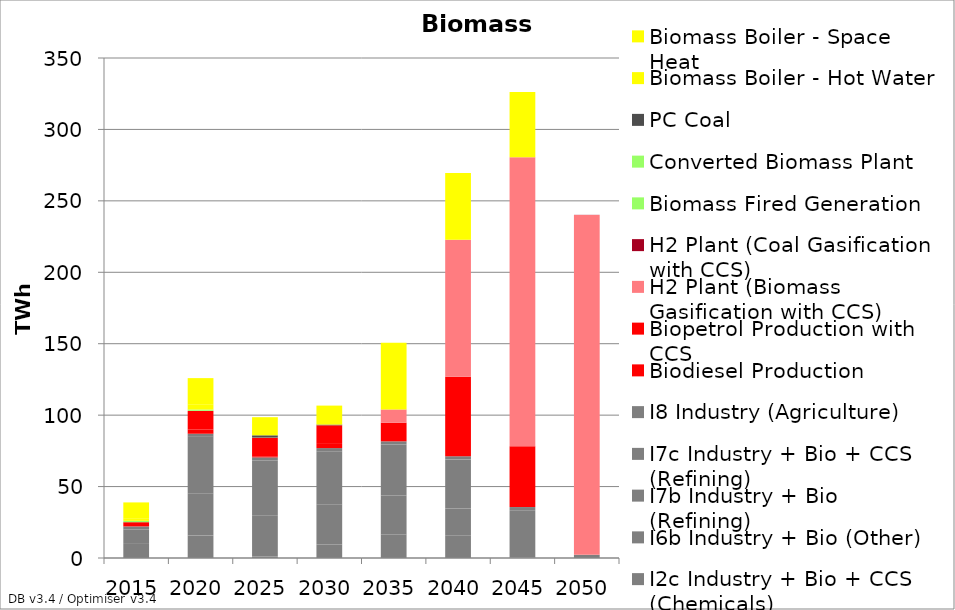
| Category | I2b Industry + Bio (Chemicals) | I2c Industry + Bio + CCS (Chemicals) | I6b Industry + Bio (Other) | I7b Industry + Bio (Refining) | I7c Industry + Bio + CCS (Refining) | I8 Industry (Agriculture) | Biodiesel Production | Biopetrol Production with CCS | H2 Plant (Biomass Gasification with CCS) | H2 Plant (Coal Gasification with CCS) | Biomass Fired Generation | Converted Biomass Plant | PC Coal | Biomass Boiler - Hot Water | Biomass Boiler - Space Heat |
|---|---|---|---|---|---|---|---|---|---|---|---|---|---|---|---|
| 2015.0 | 0 | 0 | 9.871 | 10.114 | 0 | 2.145 | 2.93 | 0 | 0 | 0 | 0.105 | 0.853 | 0 | 1.424 | 11.467 |
| 2020.0 | 15.69 | 0 | 29.362 | 39.771 | 0 | 2.162 | 2.93 | 13.047 | 0 | 0 | 0.085 | 0.872 | 0 | 3.354 | 18.643 |
| 2025.0 | 0 | 1.157 | 28.704 | 37.969 | 0.445 | 2.177 | 0.733 | 13.011 | 0 | 0 | 0.126 | 0 | 1.559 | 0 | 12.688 |
| 2030.0 | 0 | 9.566 | 28.117 | 0 | 37.069 | 2.19 | 2.93 | 13.029 | 0 | 0 | 0.042 | 0 | 0.455 | 0 | 13.282 |
| 2035.0 | 0 | 16.487 | 27.26 | 0 | 35.727 | 2.203 | 0 | 13.047 | 9.255 | 0 | 0.021 | 0 | 0 | 0 | 46.619 |
| 2040.0 | 0 | 15.903 | 18.708 | 0 | 34.415 | 2.215 | 0 | 55.563 | 96.023 | 0 | 0 | 0 | 0 | 0 | 46.644 |
| 2045.0 | 0 | 0.34 | 0 | 0 | 33.107 | 2.225 | 0 | 42.516 | 202.37 | 0 | 0 | 0 | 0 | 0 | 45.682 |
| 2050.0 | 0 | 0 | 0 | 0 | 0 | 2.235 | 0 | 0 | 237.939 | 0.091 | 0 | 0 | 0 | 0 | 0 |